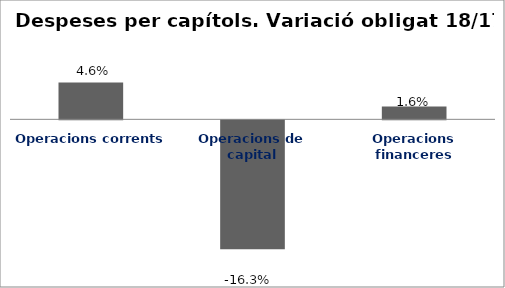
| Category | Series 0 |
|---|---|
| Operacions corrents | 0.046 |
| Operacions de capital | -0.163 |
| Operacions financeres | 0.016 |